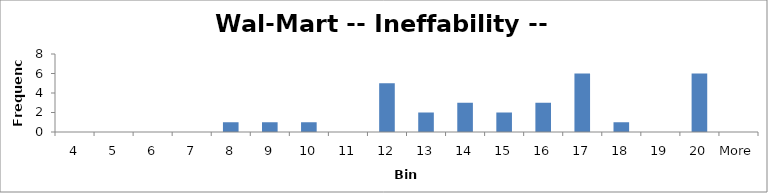
| Category | Frequency |
|---|---|
| 4 | 0 |
| 5 | 0 |
| 6 | 0 |
| 7 | 0 |
| 8 | 1 |
| 9 | 1 |
| 10 | 1 |
| 11 | 0 |
| 12 | 5 |
| 13 | 2 |
| 14 | 3 |
| 15 | 2 |
| 16 | 3 |
| 17 | 6 |
| 18 | 1 |
| 19 | 0 |
| 20 | 6 |
| More | 0 |